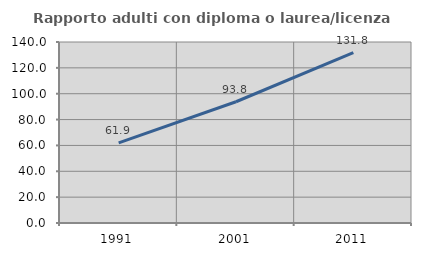
| Category | Rapporto adulti con diploma o laurea/licenza media  |
|---|---|
| 1991.0 | 61.93 |
| 2001.0 | 93.784 |
| 2011.0 | 131.756 |